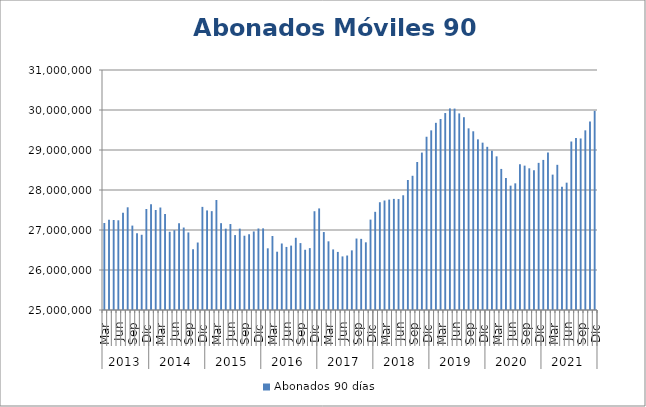
| Category | Abonados 90 días  |
|---|---|
| 0 | 27174429 |
| 1 | 27256799 |
| 2 | 27249896 |
| 3 | 27242396 |
| 4 | 27430194 |
| 5 | 27567464 |
| 6 | 27110010 |
| 7 | 26919316 |
| 8 | 26880609 |
| 9 | 27524963 |
| 10 | 27646717 |
| 11 | 27499992 |
| 12 | 27562088 |
| 13 | 27401040 |
| 14 | 26955717 |
| 15 | 26994609 |
| 16 | 27169188 |
| 17 | 27061687 |
| 18 | 26939071 |
| 19 | 26516500 |
| 20 | 26687326 |
| 21 | 27578143 |
| 22 | 27489223 |
| 23 | 27471553 |
| 24 | 27750473 |
| 25 | 27170692 |
| 26 | 27033211 |
| 27 | 27149172 |
| 28 | 26872979 |
| 29 | 27034173 |
| 30 | 26856662 |
| 31 | 26893632 |
| 32 | 26963755 |
| 33 | 27037951 |
| 34 | 27040824 |
| 35 | 26542149 |
| 36 | 26849710 |
| 37 | 26457447 |
| 38 | 26662676 |
| 39 | 26576782 |
| 40 | 26610099 |
| 41 | 26805521 |
| 42 | 26672717 |
| 43 | 26505805 |
| 44 | 26547173 |
| 45 | 27469211 |
| 46 | 27539556 |
| 47 | 26948853 |
| 48 | 26717067 |
| 49 | 26514588 |
| 50 | 26452370 |
| 51 | 26339907 |
| 52 | 26362130 |
| 53 | 26490787 |
| 54 | 26786764 |
| 55 | 26778405 |
| 56 | 26691976 |
| 57 | 27260107 |
| 58 | 27454349 |
| 59 | 27694179 |
| 60 | 27737550 |
| 61 | 27760296 |
| 62 | 27777818 |
| 63 | 27773600 |
| 64 | 27868225 |
| 65 | 28250702 |
| 66 | 28355724 |
| 67 | 28700770 |
| 68 | 28935345 |
| 69 | 29331337 |
| 70 | 29491024 |
| 71 | 29679237 |
| 72 | 29775295 |
| 73 | 29924167 |
| 74 | 30039747 |
| 75 | 30035533 |
| 76 | 29914508 |
| 77 | 29819526 |
| 78 | 29541515 |
| 79 | 29467889 |
| 80 | 29266254 |
| 81 | 29183632 |
| 82 | 29079792 |
| 83 | 28981844 |
| 84 | 28841431 |
| 85 | 28526784 |
| 86 | 28301120 |
| 87 | 28108523 |
| 88 | 28166641 |
| 89 | 28642033 |
| 90 | 28609093 |
| 91 | 28542251 |
| 92 | 28491894 |
| 93 | 28678391 |
| 94 | 28752211 |
| 95 | 28938768 |
| 96 | 28384493 |
| 97 | 28629528 |
| 98 | 28082081 |
| 99 | 28183255 |
| 100 | 29212338 |
| 101 | 29299889 |
| 102 | 29288162 |
| 103 | 29491621 |
| 104 | 29712937 |
| 105 | 29979539 |